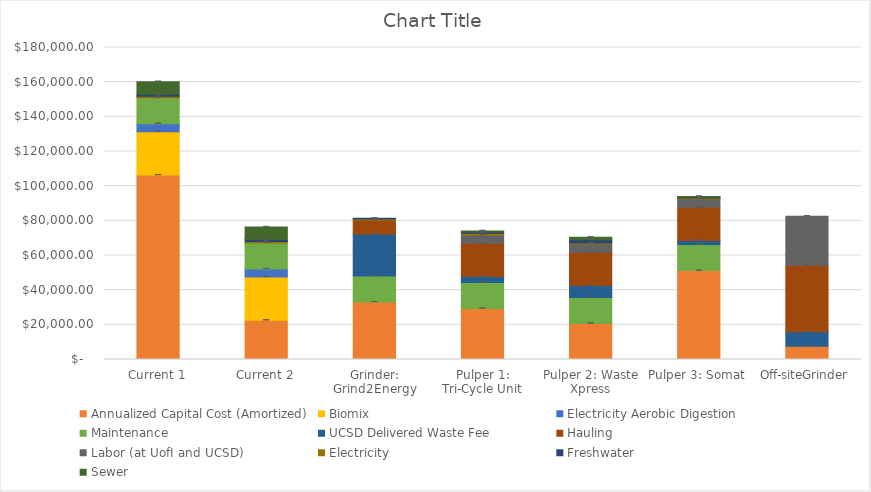
| Category | Cap Cost (Equipment, Bins & Construction) | Annualized Capital Cost (Amortized) | Operating Cost | Biomix | Electricity Aerobic Digestion | Maintenance | UCSD Delivered Waste Fee | Hauling | Labor (at UofI and UCSD) | Electricity | Freshwater | Sewer | IoT fee (Not Recommended) |
|---|---|---|---|---|---|---|---|---|---|---|---|---|---|
| Current 1 |  | 106383.557 |  | 25000 | 4665.597 | 15000 | 0 | 0 | 0 | 807.174 | 1203.84 | 7200 |  |
| Current 2 |  | 22616.977 |  | 25000 | 4665.597 | 15000 | 0 | 0 | 0 | 807.174 | 1203.84 | 7200 |  |
| Grinder: Grind2Energy |  | 33143.923 |  | 0 | 0 | 15000 | 24192 | 8064 | 0 | 600 | 481.536 | 0 |  |
| Pulper 1: Tri-Cycle Unit |  | 29376.94 |  | 0 | 0 | 15000 | 3472.358 | 19200 | 4800 | 1050 | 722.304 | 578.88 |  |
| Pulper 2: Waste Xpress |  | 20802.593 |  | 0 | 0 | 15000 | 6820.704 | 19200 | 4800 | 600 | 1805.76 | 1447.2 |  |
| Pulper 3: Somat |  | 51318.758 |  | 0 | 0 | 15000 | 2273.568 | 19200 | 4800 | 600 | 481.536 | 385.92 |  |
| Off-siteGrinder |  | 7700 |  | 0 | 0 | 0 | 8265 | 38400 | 28320 | 0 | 0 | 0 |  |